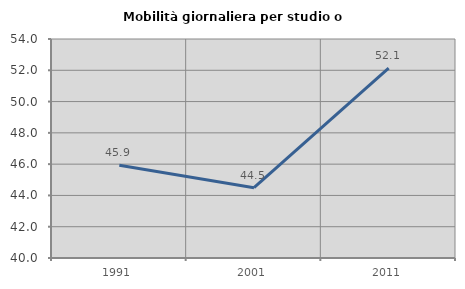
| Category | Mobilità giornaliera per studio o lavoro |
|---|---|
| 1991.0 | 45.925 |
| 2001.0 | 44.495 |
| 2011.0 | 52.137 |